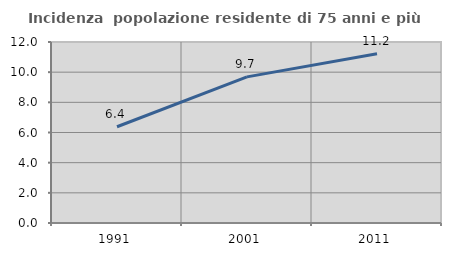
| Category | Incidenza  popolazione residente di 75 anni e più |
|---|---|
| 1991.0 | 6.381 |
| 2001.0 | 9.689 |
| 2011.0 | 11.216 |